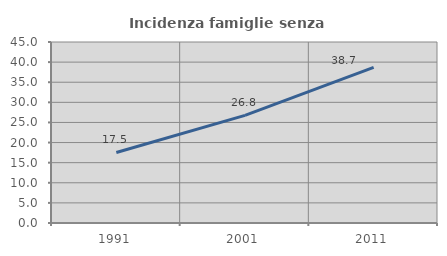
| Category | Incidenza famiglie senza nuclei |
|---|---|
| 1991.0 | 17.537 |
| 2001.0 | 26.772 |
| 2011.0 | 38.686 |